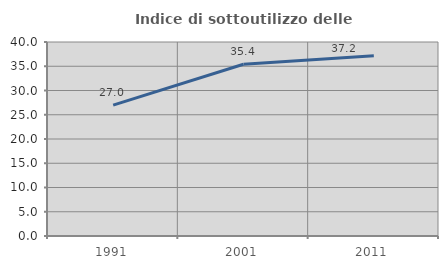
| Category | Indice di sottoutilizzo delle abitazioni  |
|---|---|
| 1991.0 | 26.99 |
| 2001.0 | 35.417 |
| 2011.0 | 37.165 |